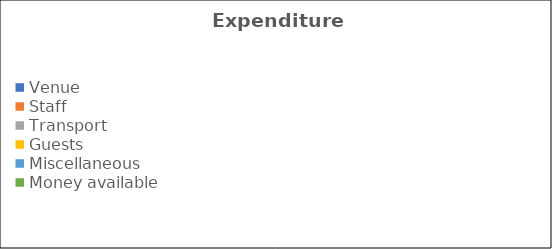
| Category | Series 0 |
|---|---|
| Venue | 0 |
| Staff | 0 |
| Transport | 0 |
| Guests | 0 |
| Miscellaneous | 0 |
| Money available | 0 |